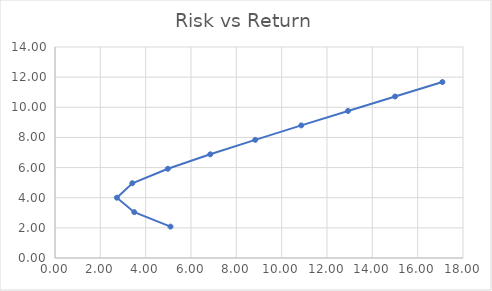
| Category | Return |
|---|---|
| 5.096871589514494 | 2.083 |
| 3.4970082556720183 | 3.043 |
| 2.7292462908244652 | 4.002 |
| 3.4113422178407378 | 4.961 |
| 4.979405383574293 | 5.92 |
| 6.849850513421247 | 6.879 |
| 8.832620108097519 | 7.838 |
| 10.866400311382908 | 8.798 |
| 12.927137553069475 | 9.757 |
| 15.00372842796877 | 10.716 |
| 17.09039496325348 | 11.675 |